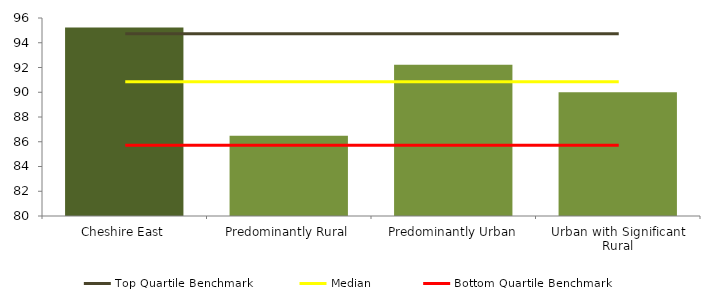
| Category | Series 0 |
|---|---|
| Cheshire East | 95.238 |
| Predominantly Rural | 86.486 |
| Predominantly Urban | 92.232 |
| Urban with Significant Rural | 89.996 |